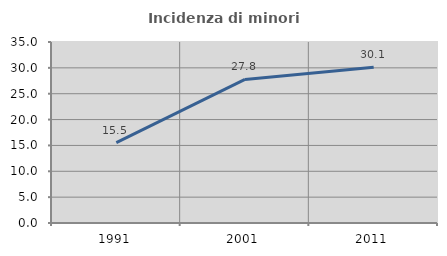
| Category | Incidenza di minori stranieri |
|---|---|
| 1991.0 | 15.534 |
| 2001.0 | 27.769 |
| 2011.0 | 30.114 |